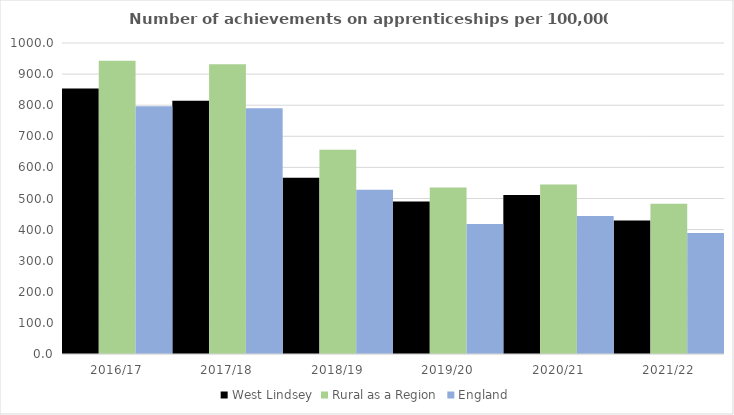
| Category | West Lindsey | Rural as a Region | England |
|---|---|---|---|
| 2016/17 | 854 | 942.594 | 797 |
| 2017/18 | 814 | 931.709 | 790 |
| 2018/19 | 567 | 656.44 | 528 |
| 2019/20 | 490 | 535.552 | 418 |
| 2020/21 | 511 | 545.333 | 444 |
| 2021/22 | 429 | 482.936 | 389 |